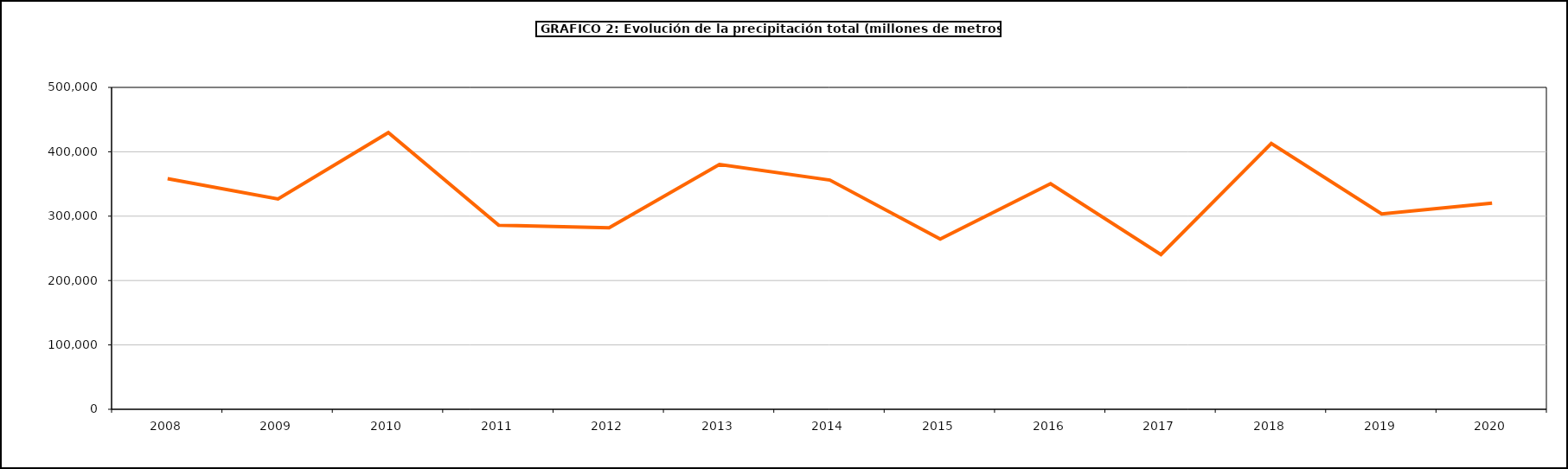
| Category | Series 0 |
|---|---|
| 2008.0 | 358273.25 |
| 2009.0 | 326778 |
| 2010.0 | 429768 |
| 2011.0 | 285948 |
| 2012.0 | 281817 |
| 2013.0 | 380420 |
| 2014.0 | 356097 |
| 2015.0 | 264511.7 |
| 2016.0 | 350442.2 |
| 2017.0 | 240463.8 |
| 2018.0 | 413003.9 |
| 2019.0 | 303475.4 |
| 2020.0 | 320234.1 |